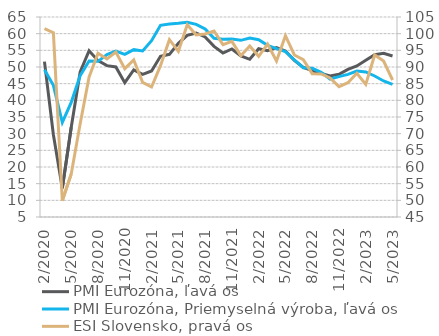
| Category | PMI Eurozóna, ľavá os | PMI Eurozóna, Priemyselná výroba, ľavá os |
|---|---|---|
| 2020-02-01 | 51.6 | 49.2 |
| 2020-03-01 | 29.7 | 44.5 |
| 2020-04-01 | 13.6 | 33.4 |
| 2020-05-01 | 31.9 | 39.4 |
| 2020-06-01 | 48.5 | 47.4 |
| 2020-07-01 | 54.9 | 51.8 |
| 2020-08-01 | 51.9 | 51.7 |
| 2020-09-01 | 50.4 | 53.7 |
| 2020-10-01 | 50 | 54.8 |
| 2020-11-01 | 45.3 | 53.8 |
| 2020-12-01 | 49.1 | 55.2 |
| 2021-01-01 | 47.8 | 54.8 |
| 2021-02-01 | 48.8 | 57.9 |
| 2021-03-01 | 53.2 | 62.5 |
| 2021-04-01 | 53.8 | 62.9 |
| 2021-05-01 | 57.1 | 63.1 |
| 2021-06-01 | 59.5 | 63.4 |
| 2021-07-01 | 60.2 | 62.8 |
| 2021-08-01 | 59 | 61.4 |
| 2021-09-01 | 56.2 | 58.6 |
| 2021-10-01 | 54.2 | 58.3 |
| 2021-11-01 | 55.4 | 58.4 |
| 2021-12-01 | 53.3 | 58 |
| 2022-01-01 | 52.3 | 58.7 |
| 2022-02-01 | 55.5 | 58.2 |
| 2022-03-01 | 54.9 | 56.5 |
| 2022-04-01 | 55.8 | 55.5 |
| 2022-05-01 | 54.8 | 54.6 |
| 2022-06-01 | 52 | 52.1 |
| 2022-07-01 | 49.9 | 49.8 |
| 2022-08-01 | 48.9 | 49.6 |
| 2022-09-01 | 48.1 | 48.4 |
| 2022-10-01 | 47.3 | 46.4 |
| 2022-11-01 | 47.8 | 47.1 |
| 2022-12-01 | 49.3 | 47.8 |
| 2023-01-01 | 50.3 | 48.8 |
| 2023-02-01 | 52 | 48.5 |
| 2023-03-01 | 53.7 | 47.3 |
| 2023-04-01 | 54.1 | 45.8 |
| 2023-05-01 | 53.3 | 44.8 |